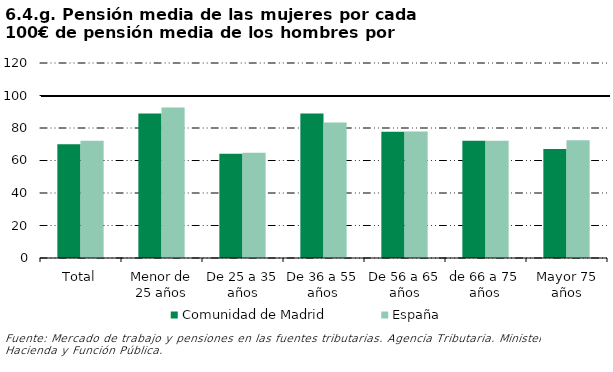
| Category | Comunidad de Madrid | España |
|---|---|---|
| Total | 70.065 | 72.229 |
| Menor de 25 años | 88.926 | 92.576 |
| De 25 a 35 años | 64.182 | 64.715 |
| De 36 a 55 años | 88.957 | 83.399 |
| De 56 a 65 años | 77.664 | 77.828 |
| de 66 a 75 años | 72.195 | 72.095 |
| Mayor 75 años | 67.011 | 72.405 |